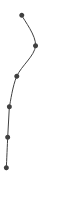
| Category | Series 0 |
|---|---|
| 0.25716457661235054 | 1 |
| 0.48344413229901306 | 2 |
| 0.17531086449567307 | 3 |
| 0.05359116244230933 | 4 |
| 0.02640527392449897 | 5 |
| 0.004000196209907587 | 6 |